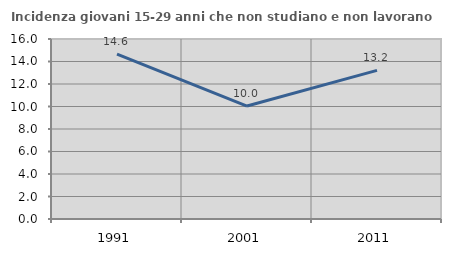
| Category | Incidenza giovani 15-29 anni che non studiano e non lavorano  |
|---|---|
| 1991.0 | 14.646 |
| 2001.0 | 10.04 |
| 2011.0 | 13.209 |